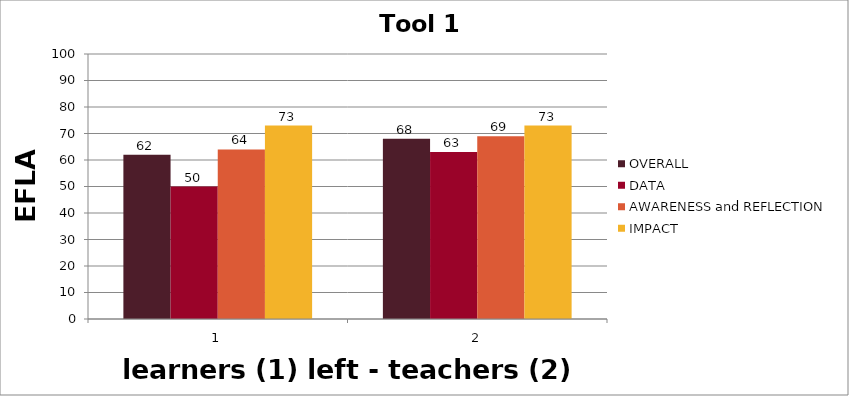
| Category | OVERALL | DATA | AWARENESS and REFLECTION | IMPACT |
|---|---|---|---|---|
| 0 | 62 | 50 | 64 | 73 |
| 1 | 68 | 63 | 69 | 73 |